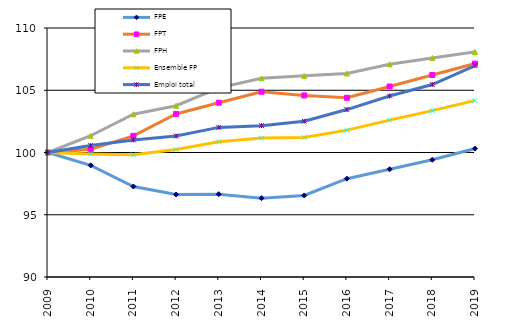
| Category | FPE | FPT | FPH | Ensemble FP | Emploi total |
|---|---|---|---|---|---|
| 2009.0 | 100 | 100 | 100 | 100 | 100 |
| 2010.0 | 98.967 | 100.251 | 101.346 | 99.882 | 100.563 |
| 2011.0 | 97.268 | 101.338 | 103.07 | 99.814 | 101.009 |
| 2012.0 | 96.624 | 103.096 | 103.759 | 100.246 | 101.324 |
| 2013.0 | 96.653 | 104 | 105.193 | 100.855 | 102.016 |
| 2014.0 | 96.33 | 104.881 | 105.958 | 101.157 | 102.158 |
| 2015.0 | 96.55 | 104.585 | 106.158 | 101.2 | 102.516 |
| 2016.0 | 97.899 | 104.395 | 106.352 | 101.797 | 103.449 |
| 2017.0 | 98.652 | 105.301 | 107.083 | 102.597 | 104.539 |
| 2018.0 | 99.417 | 106.224 | 107.597 | 103.364 | 105.458 |
| 2019.0 | 100.313 | 107.138 | 108.08 | 104.182 | 106.978 |